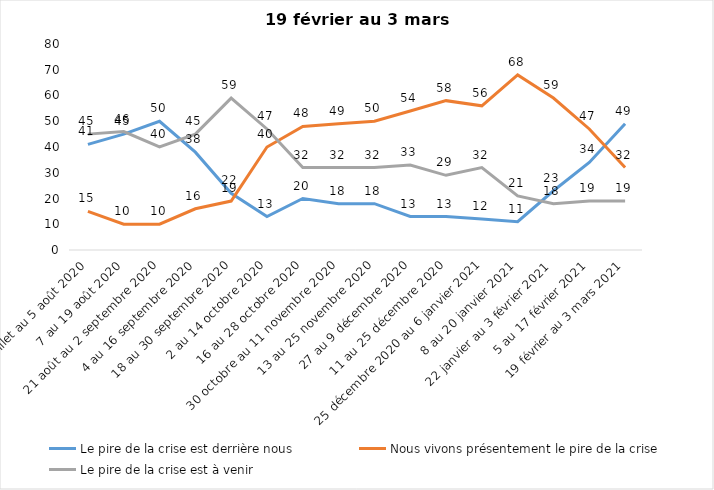
| Category | Le pire de la crise est derrière nous | Nous vivons présentement le pire de la crise | Le pire de la crise est à venir |
|---|---|---|---|
| 24 juillet au 5 août 2020 | 41 | 15 | 45 |
| 7 au 19 août 2020 | 45 | 10 | 46 |
| 21 août au 2 septembre 2020 | 50 | 10 | 40 |
| 4 au 16 septembre 2020 | 38 | 16 | 45 |
| 18 au 30 septembre 2020 | 22 | 19 | 59 |
| 2 au 14 octobre 2020 | 13 | 40 | 47 |
| 16 au 28 octobre 2020 | 20 | 48 | 32 |
| 30 octobre au 11 novembre 2020 | 18 | 49 | 32 |
| 13 au 25 novembre 2020 | 18 | 50 | 32 |
| 27 au 9 décembre 2020 | 13 | 54 | 33 |
| 11 au 25 décembre 2020 | 13 | 58 | 29 |
| 25 décembre 2020 au 6 janvier 2021 | 12 | 56 | 32 |
| 8 au 20 janvier 2021 | 11 | 68 | 21 |
| 22 janvier au 3 février 2021 | 23 | 59 | 18 |
| 5 au 17 février 2021 | 34 | 47 | 19 |
| 19 février au 3 mars 2021 | 49 | 32 | 19 |